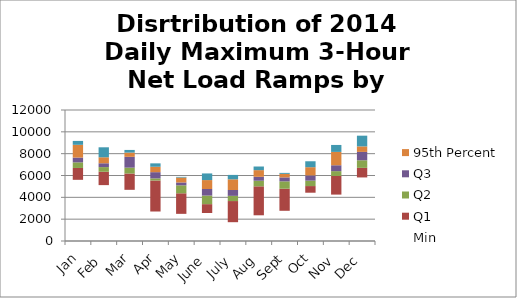
| Category | Min | Q1 | Q2 | Q3 | 95th Percent | Top 5 Percent |
|---|---|---|---|---|---|---|
| Jan | 5603.761 | 1086.713 | 513.06 | 438.41 | 1169.377 | 355.726 |
| Feb | 5118.777 | 1222.393 | 429.522 | 349.825 | 549.124 | 913.932 |
| Mar | 4687.218 | 1494.179 | 537.604 | 991.654 | 387.694 | 242.559 |
| Apr | 2701.696 | 2840.388 | 194.804 | 568.606 | 495.532 | 311.495 |
| May | 2487.279 | 1883.108 | 730.724 | 263.166 | 448.964 | 59.759 |
| June | 2566.786 | 808.805 | 786.819 | 598.912 | 820.143 | 607.809 |
| July | 1722.645 | 1936.237 | 477.345 | 533.148 | 981.532 | 403.279 |
| Aug | 2354.762 | 2653.679 | 514.259 | 356.772 | 612.465 | 331.942 |
| Sept | 2767.047 | 2020.84 | 675.67 | 362.679 | 323.914 | 88.983 |
| Oct | 4423.182 | 609.155 | 497.108 | 478.169 | 753.134 | 543.728 |
| Nov | 4250.188 | 1708.151 | 441.308 | 538.92 | 1223.069 | 636.885 |
| Dec | 5821.896 | 877.472 | 695.359 | 766.729 | 506.089 | 980.492 |